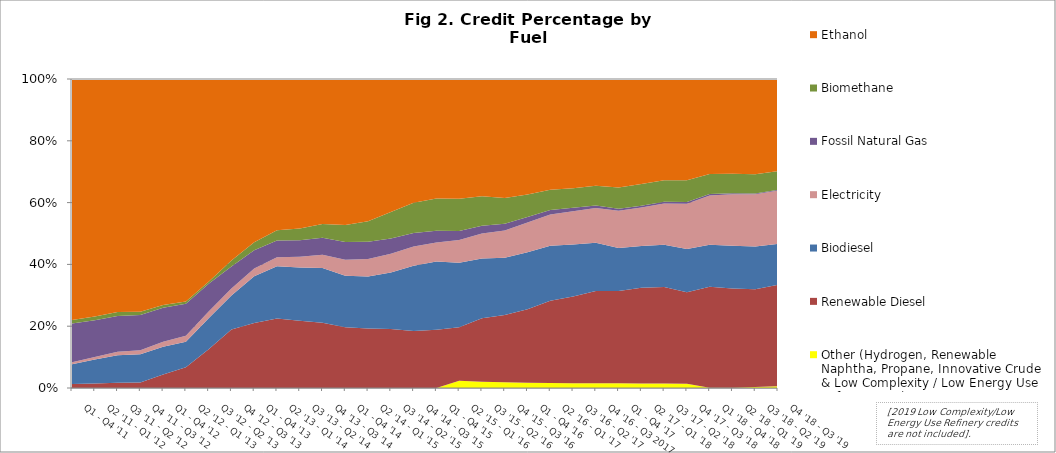
| Category | Other (Hydrogen, Renewable Naphtha, Propane, Innovative Crude & Low Complexity / Low Energy Use Refining, etc.) | Renewable Diesel | Biodiesel | Electricity | Fossil Natural Gas | Biomethane | Ethanol |
|---|---|---|---|---|---|---|---|
| Q1 - Q4 '11 | 0 | 4255 | 21066.75 | 1935.75 | 41097.5 | 3678.75 | 255888.25 |
| Q2 '11 - Q1 '12 | 0 | 5162.75 | 26837.25 | 2950.75 | 41170.5 | 4217.5 | 266727.25 |
| Q3 '11 - Q2 '12 | 0 | 6021.75 | 31928.25 | 4017.5 | 41417.75 | 4505.5 | 269743.5 |
| Q4 '11 - Q3 '12 | 0 | 6915.75 | 34835.25 | 5227.25 | 43542.5 | 4159.75 | 288811 |
| Q1 - Q4 '12 | 0 | 18164.75 | 37336.75 | 6746 | 45792.5 | 3711.25 | 304773.5 |
| Q2 '12 - Q1 '13 | 0 | 32600.75 | 40337.75 | 9379 | 50547.5 | 3679.5 | 351042.25 |
| Q3 '12 - Q2 '13 | 0 | 75473 | 60626 | 12868 | 54269.25 | 3920 | 394796.75 |
| Q4 '12 - Q3 '13 | 0 | 145738 | 84731.75 | 17304.25 | 54483.5 | 15309 | 451907.5 |
| Q1 - Q4 '13 | 0 | 197482.25 | 141667.5 | 23488.25 | 55463.75 | 24529.5 | 495969.5 |
| Q2 '13 - Q1 '14 | 0 | 229472.75 | 172125.5 | 30163.75 | 55062.5 | 33904.25 | 499193 |
| Q3 '13 - Q2 '14 | 0 | 237650.5 | 187184.5 | 38057.75 | 58140 | 42082 | 527117.75 |
| Q4 '13 - Q3 '14 | 0 | 230531.5 | 193299.25 | 46639.5 | 60638.5 | 47945.25 | 512500.5 |
| Q1 - Q4 '14 | 0 | 211244.75 | 179500 | 55332.5 | 61754 | 59889.5 | 507720.75 |
| Q2 '14 - Q1 '15 | 0 | 214231 | 186099.25 | 63321.25 | 62283.5 | 73451.75 | 511213.5 |
| Q3 '14 - Q2 '15 | 0 | 221521.75 | 212265.5 | 70066.25 | 57394.25 | 99920 | 499516 |
| Q4 '14 - Q3 '15 | 12.5 | 231039 | 264657.25 | 77983.75 | 54630.5 | 123086 | 502037.5 |
| Q1 - Q4 '15 | 18.5 | 259542.75 | 303477.5 | 84435 | 51526.5 | 143903.25 | 531188.5 |
| Q2 '15 - Q1 '16 | 37968.75 | 277096.75 | 335225.5 | 117624 | 47534 | 166579.25 | 622043.5 |
| Q3 '15 - Q2 '16 | 38112.25 | 384694.75 | 361311.75 | 152143.25 | 46525.5 | 178521.5 | 710200 |
| Q4 '15 - Q3 '16 | 39251.167 | 454443.5 | 387917 | 185794.25 | 44372.25 | 175672.25 | 805507.75 |
| Q1 - Q4 '16 | 39246.25 | 560304.25 | 434195.75 | 226175.75 | 42687.5 | 170422.25 | 879846.5 |
| Q2 '16 - Q1 '17 | 38815.333 | 644325.25 | 430204 | 244170.25 | 35748 | 157929.5 | 866449 |
| Q3 '16 - Q2 '17 | 38495.25 | 685591.75 | 412601.75 | 263683.25 | 27637.75 | 153419.75 | 866394.5 |
| Q4 '16 - Q3 2017 | 37963.75 | 752235 | 393268 | 282887.5 | 20857.75 | 161286.75 | 869357.25 |
| Q1 - Q4 '17 | 37501.5 | 741682.5 | 345519.5 | 299528.5 | 14623.5 | 170246.25 | 872056 |
| Q2 '17 - Q1 '18 | 37136.75 | 794697.25 | 345443.75 | 320878.25 | 14438.75 | 180942.75 | 870380.25 |
| Q3 '17 - Q2 '18 | 36755 | 811822.25 | 354343.5 | 346263 | 15099 | 180192.25 | 850128.25 |
| Q4 '17 - Q3 '18 | 36385.75 | 771975.75 | 366448.5 | 381619.5 | 15325 | 183354.75 | 854713.25 |
| Q1 '18 - Q4 '18 | 2920.55 | 936189.4 | 390857.2 | 456448 | 13381.6 | 186642.6 | 881172.6 |
| Q2 '18 - Q1 '19 | 3799 | 1026714.5 | 441368 | 531788.083 | 11162.667 | 200864.667 | 980822.167 |
| Q3 '18 - Q2 '19 | 9640.85 | 1051232.4 | 458140 | 561124.4 | 10002.4 | 206938.6 | 1021798.2 |
| Q4 '18 - Q3 '19 | 21269.75 | 1142847.25 | 462173.25 | 600188.5 | 8775.75 | 209180.5 | 1039762.5 |